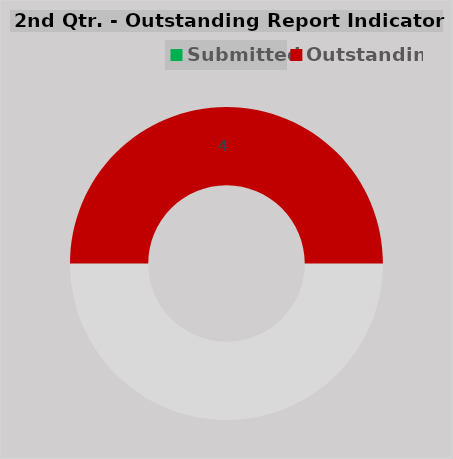
| Category | Series 0 |
|---|---|
|  | 4 |
| Submitted | 0 |
| Outstanding | 4 |